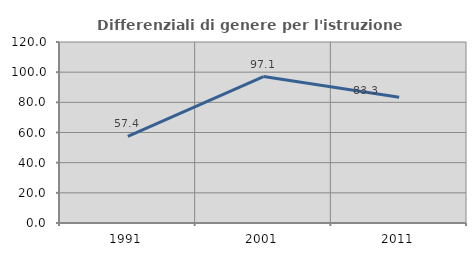
| Category | Differenziali di genere per l'istruzione superiore |
|---|---|
| 1991.0 | 57.398 |
| 2001.0 | 97.105 |
| 2011.0 | 83.34 |